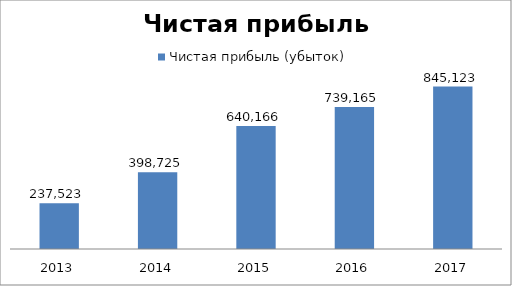
| Category | Чистая прибыль (убыток) |
|---|---|
| 2013.0 | 237522.597 |
| 2014.0 | 398725.5 |
| 2015.0 | 640165.997 |
| 2016.0 | 739165.133 |
| 2017.0 | 845122.539 |